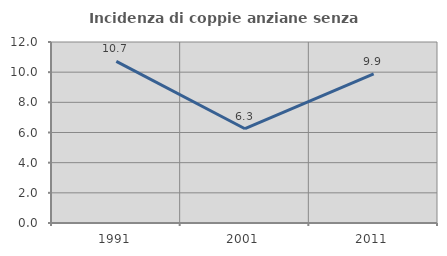
| Category | Incidenza di coppie anziane senza figli  |
|---|---|
| 1991.0 | 10.714 |
| 2001.0 | 6.25 |
| 2011.0 | 9.884 |